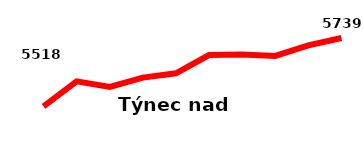
| Category | Týnec nad Sázavou |
|---|---|
| 2010 | 5518 |
| 2011 | 5599 |
| 2012 | 5581 |
| 2013 | 5611 |
| 2014 | 5625 |
| 2015 | 5684 |
| 2016 | 5686 |
| 2017 | 5681 |
| 2018 | 5715 |
| 2019 | 5739 |